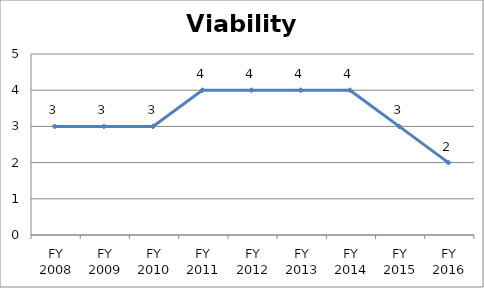
| Category | Viability score |
|---|---|
| FY 2016 | 2 |
| FY 2015 | 3 |
| FY 2014 | 4 |
| FY 2013 | 4 |
| FY 2012 | 4 |
| FY 2011 | 4 |
| FY 2010 | 3 |
| FY 2009 | 3 |
| FY 2008 | 3 |